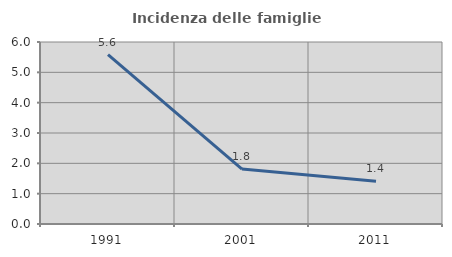
| Category | Incidenza delle famiglie numerose |
|---|---|
| 1991.0 | 5.585 |
| 2001.0 | 1.81 |
| 2011.0 | 1.409 |